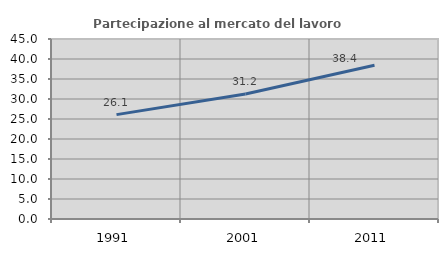
| Category | Partecipazione al mercato del lavoro  femminile |
|---|---|
| 1991.0 | 26.095 |
| 2001.0 | 31.237 |
| 2011.0 | 38.429 |